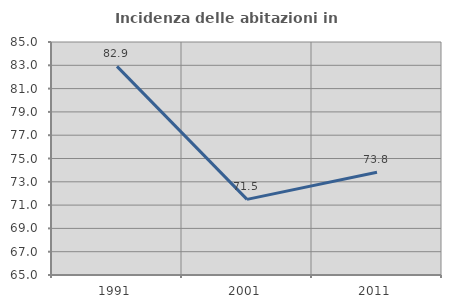
| Category | Incidenza delle abitazioni in proprietà  |
|---|---|
| 1991.0 | 82.911 |
| 2001.0 | 71.491 |
| 2011.0 | 73.817 |